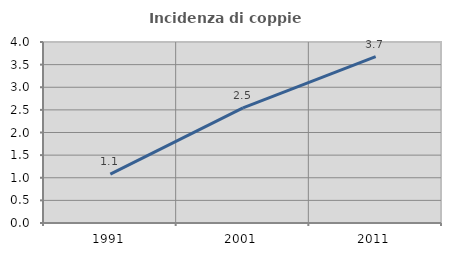
| Category | Incidenza di coppie miste |
|---|---|
| 1991.0 | 1.08 |
| 2001.0 | 2.542 |
| 2011.0 | 3.675 |